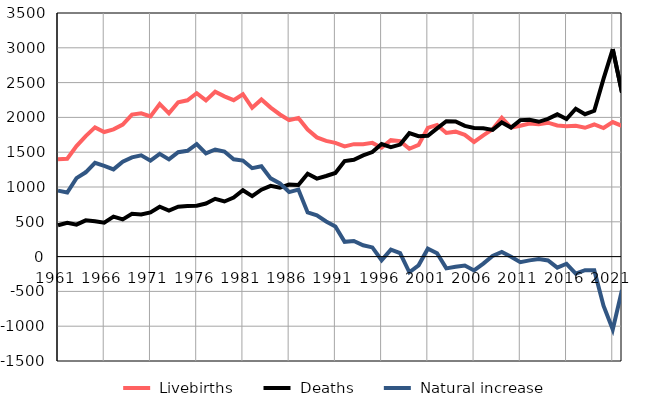
| Category |  Livebirths |  Deaths |  Natural increase |
|---|---|---|---|
| 1961.0 | 1399 | 451 | 948 |
| 1962.0 | 1406 | 485 | 921 |
| 1963.0 | 1587 | 459 | 1128 |
| 1964.0 | 1732 | 521 | 1211 |
| 1965.0 | 1857 | 509 | 1348 |
| 1966.0 | 1790 | 488 | 1302 |
| 1967.0 | 1828 | 575 | 1253 |
| 1968.0 | 1897 | 534 | 1363 |
| 1969.0 | 2040 | 614 | 1426 |
| 1970.0 | 2059 | 604 | 1455 |
| 1971.0 | 2013 | 635 | 1378 |
| 1972.0 | 2193 | 716 | 1477 |
| 1973.0 | 2058 | 662 | 1396 |
| 1974.0 | 2217 | 717 | 1500 |
| 1975.0 | 2246 | 726 | 1520 |
| 1976.0 | 2348 | 731 | 1617 |
| 1977.0 | 2244 | 762 | 1482 |
| 1978.0 | 2369 | 830 | 1539 |
| 1979.0 | 2302 | 792 | 1510 |
| 1980.0 | 2247 | 848 | 1399 |
| 1981.0 | 2333 | 953 | 1380 |
| 1982.0 | 2138 | 868 | 1270 |
| 1983.0 | 2258 | 961 | 1297 |
| 1984.0 | 2141 | 1017 | 1124 |
| 1985.0 | 2042 | 990 | 1052 |
| 1986.0 | 1961 | 1034 | 927 |
| 1987.0 | 1991 | 1028 | 963 |
| 1988.0 | 1825 | 1191 | 634 |
| 1989.0 | 1713 | 1121 | 592 |
| 1990.0 | 1663 | 1158 | 505 |
| 1991.0 | 1635 | 1202 | 433 |
| 1992.0 | 1584 | 1372 | 212 |
| 1993.0 | 1616 | 1391 | 225 |
| 1994.0 | 1616 | 1454 | 162 |
| 1995.0 | 1634 | 1502 | 132 |
| 1996.0 | 1565 | 1618 | -53 |
| 1997.0 | 1673 | 1573 | 100 |
| 1998.0 | 1659 | 1609 | 50 |
| 1999.0 | 1549 | 1774 | -225 |
| 2000.0 | 1604 | 1729 | -125 |
| 2001.0 | 1849 | 1735 | 114 |
| 2002.0 | 1892 | 1843 | 49 |
| 2003.0 | 1776 | 1945 | -169 |
| 2004.0 | 1795 | 1942 | -147 |
| 2005.0 | 1750 | 1878 | -128 |
| 2006.0 | 1648 | 1847 | -199 |
| 2007.0 | 1743 | 1843 | -100 |
| 2008.0 | 1829 | 1820 | 9 |
| 2009.0 | 1995 | 1927 | 68 |
| 2010.0 | 1853 | 1854 | -1 |
| 2011.0 | 1880 | 1961 | -81 |
| 2012.0 | 1912 | 1966 | -54 |
| 2013.0 | 1901 | 1937 | -36 |
| 2014.0 | 1924 | 1979 | -55 |
| 2015.0 | 1885 | 2044 | -159 |
| 2016.0 | 1873 | 1976 | -103 |
| 2017.0 | 1879 | 2124 | -245 |
| 2018.0 | 1851 | 2046 | -195 |
| 2019.0 | 1898 | 2095 | -197 |
| 2020.0 | 1847 | 2553 | -706 |
| 2021.0 | 1933 | 2981 | -1048 |
| 2022.0 | 1878 | 2356 | -478 |